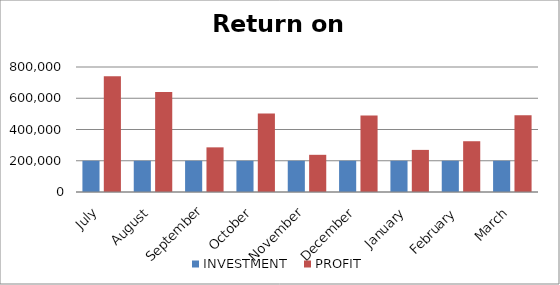
| Category | INVESTMENT  | PROFIT |
|---|---|---|
| July | 200000 | 740068 |
| August | 200000 | 639420 |
| September | 200000 | 285737 |
| October | 200000 | 502759 |
| November | 200000 | 238010 |
| December | 200000 | 490130 |
| January | 200000 | 269462 |
| February | 200000 | 324900 |
| March | 200000 | 490600 |